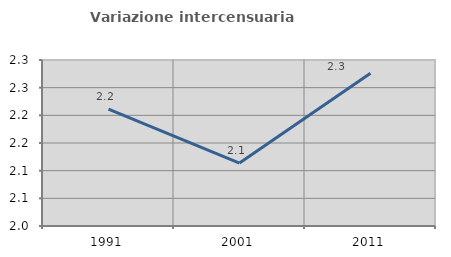
| Category | Variazione intercensuaria annua |
|---|---|
| 1991.0 | 2.211 |
| 2001.0 | 2.114 |
| 2011.0 | 2.276 |